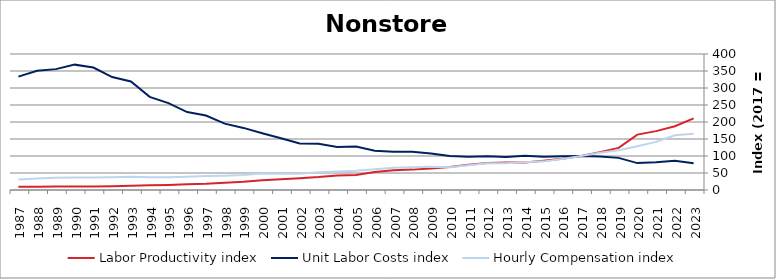
| Category | Labor Productivity index | Unit Labor Costs index | Hourly Compensation index |
|---|---|---|---|
| 2023.0 | 210.742 | 78.4 | 165.223 |
| 2022.0 | 187.606 | 85.785 | 160.937 |
| 2021.0 | 173.118 | 81.706 | 141.447 |
| 2020.0 | 162.975 | 79.13 | 128.962 |
| 2019.0 | 123.832 | 94.502 | 117.024 |
| 2018.0 | 111.425 | 98.394 | 109.635 |
| 2017.0 | 100 | 100 | 100 |
| 2016.0 | 91.932 | 99.274 | 91.265 |
| 2015.0 | 85.907 | 98.007 | 84.195 |
| 2014.0 | 81.07 | 100.823 | 81.738 |
| 2013.0 | 80.973 | 97.257 | 78.753 |
| 2012.0 | 79.223 | 99.621 | 78.923 |
| 2011.0 | 74.261 | 97.678 | 72.537 |
| 2010.0 | 67.312 | 99.898 | 67.243 |
| 2009.0 | 63.57 | 107.171 | 68.128 |
| 2008.0 | 59.93 | 112.244 | 67.268 |
| 2007.0 | 57.753 | 112.777 | 65.132 |
| 2006.0 | 53.033 | 115.641 | 61.328 |
| 2005.0 | 44.306 | 128.124 | 56.767 |
| 2004.0 | 42.936 | 126.436 | 54.287 |
| 2003.0 | 38.228 | 136.282 | 52.098 |
| 2002.0 | 34.789 | 137.097 | 47.695 |
| 2001.0 | 31.294 | 152.305 | 47.662 |
| 2000.0 | 29.014 | 166.837 | 48.407 |
| 1999.0 | 24.323 | 182.608 | 44.415 |
| 1998.0 | 21.624 | 195.29 | 42.229 |
| 1997.0 | 18.713 | 219.085 | 40.998 |
| 1996.0 | 17.067 | 229.266 | 39.129 |
| 1995.0 | 14.806 | 255.471 | 37.826 |
| 1994.0 | 13.7 | 273.865 | 37.521 |
| 1993.0 | 12.134 | 319.052 | 38.713 |
| 1992.0 | 11.201 | 332.255 | 37.216 |
| 1991.0 | 10.236 | 360.111 | 36.862 |
| 1990.0 | 9.973 | 368.713 | 36.772 |
| 1989.0 | 10.049 | 355.495 | 35.722 |
| 1988.0 | 9.658 | 350.786 | 33.88 |
| 1987.0 | 9.237 | 333.447 | 30.8 |